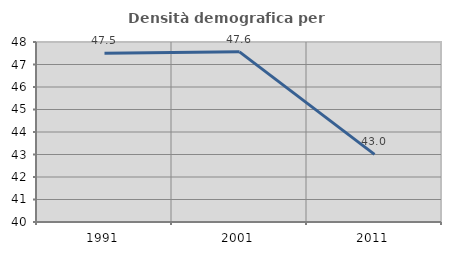
| Category | Densità demografica |
|---|---|
| 1991.0 | 47.495 |
| 2001.0 | 47.561 |
| 2011.0 | 43.003 |